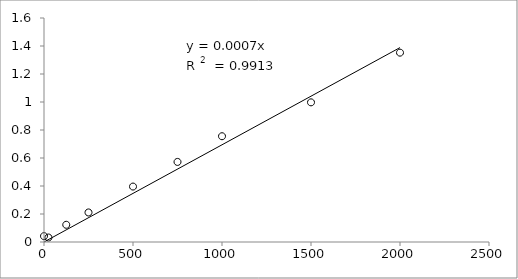
| Category | Series 0 |
|---|---|
| 2000.0 | 1.352 |
| 1500.0 | 0.998 |
| 1000.0 | 0.756 |
| 750.0 | 0.572 |
| 500.0 | 0.396 |
| 250.0 | 0.211 |
| 125.0 | 0.123 |
| 25.0 | 0.032 |
| 0.0 | 0.042 |